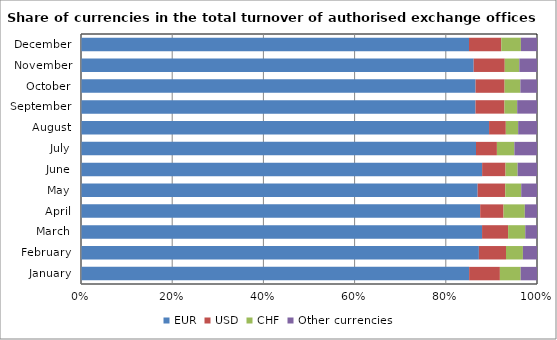
| Category | EUR | USD | CHF | Other currencies |
|---|---|---|---|---|
| January | 0.851 | 0.067 | 0.046 | 0.036 |
| February | 0.873 | 0.059 | 0.037 | 0.031 |
| March | 0.88 | 0.057 | 0.038 | 0.026 |
| April | 0.875 | 0.051 | 0.047 | 0.027 |
| May | 0.87 | 0.061 | 0.035 | 0.035 |
| June | 0.88 | 0.051 | 0.027 | 0.042 |
| July | 0.866 | 0.046 | 0.038 | 0.05 |
| August | 0.895 | 0.037 | 0.027 | 0.041 |
| September | 0.865 | 0.064 | 0.028 | 0.043 |
| October | 0.865 | 0.064 | 0.035 | 0.036 |
| November | 0.861 | 0.068 | 0.032 | 0.039 |
| December | 0.851 | 0.071 | 0.043 | 0.035 |